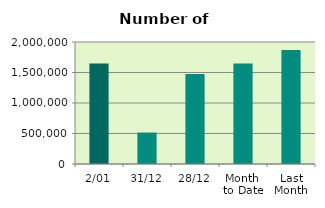
| Category | Series 0 |
|---|---|
| 2/01 | 1647070 |
| 31/12 | 515878 |
| 28/12 | 1474934 |
| Month 
to Date | 1647070 |
| Last
Month | 1866821.895 |